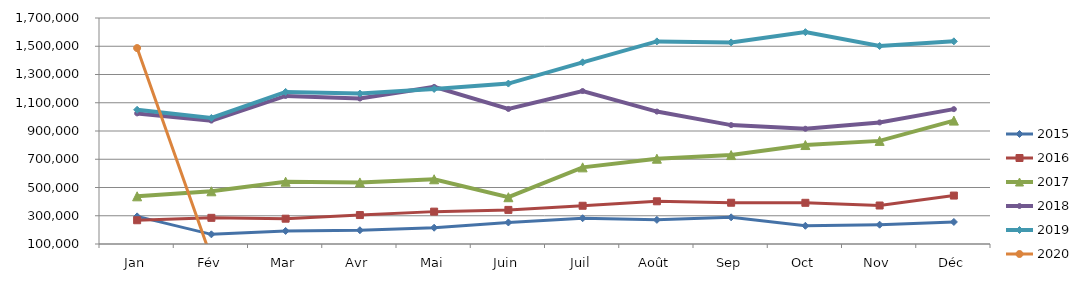
| Category | 2015 | 2016 | 2017 | 2018 | 2019 | 2020 |
|---|---|---|---|---|---|---|
| Jan | 295561.257 | 268143.886 | 437608.679 | 1024591.283 | 1050220.805 | 1487095.506 |
| Fév | 168352.236 | 285225.823 | 473128.689 | 973642.608 | 992184.961 | 0 |
| Mar | 192553.569 | 279133.643 | 541018.539 | 1147958.731 | 1176757.88 | 0 |
| Avr | 197433.052 | 304918.016 | 535872.374 | 1129676.714 | 1164825.987 | 0 |
| Mai | 215249.669 | 329195.488 | 558232.45 | 1212070.878 | 1197851.486 | 0 |
| Juin | 252442.012 | 341474.145 | 431128.916 | 1056092.947 | 1235809.908 | 0 |
| Juil | 282492.061 | 370771.491 | 642508.579 | 1183060.966 | 1386180.582 | 0 |
| Août | 270853.736 | 402331.575 | 703832.356 | 1037606.311 | 1534426.4 | 0 |
| Sep | 288809.458 | 392045.647 | 729625.421 | 941820.554 | 1527323.009 | 0 |
| Oct | 228913.761 | 391645.177 | 800645.955 | 915772.772 | 1599889.902 | 0 |
| Nov | 236677.943 | 372499.386 | 830004.967 | 960817.552 | 1501599.407 | 0 |
| Déc | 256052.835 | 442895.412 | 973525.964 | 1054685.303 | 1534756.751 | 0 |